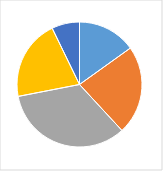
| Category | Series 0 |
|---|---|
| 0 | 0.152 |
| 1 | 0.232 |
| 2 | 0.341 |
| 3 | 0.21 |
| 4 | 0.072 |